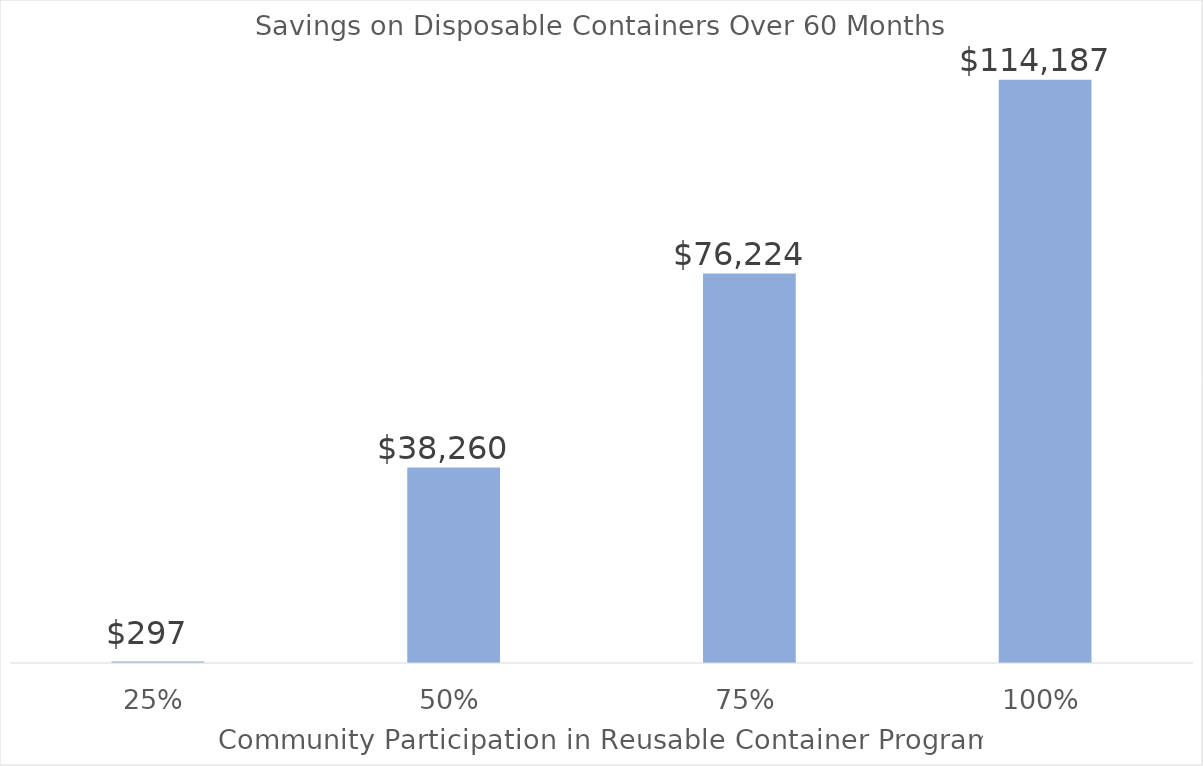
| Category | Series 0 |
|---|---|
| 0.25 | 296.512 |
| 0.5 | 38260.025 |
| 0.75 | 76223.537 |
| 1.0 | 114187.05 |